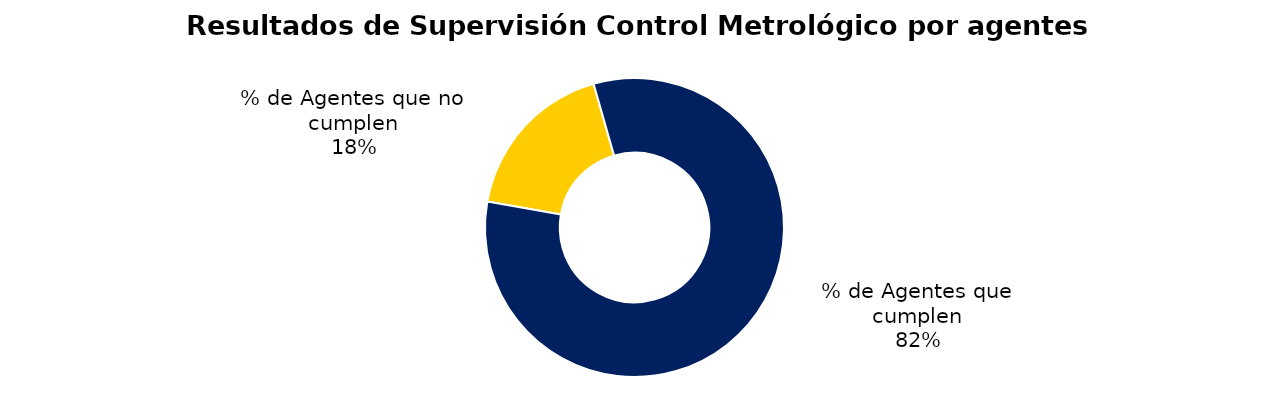
| Category | Series 0 |
|---|---|
| % de Agentes que no cumplen | 26 |
| % de Agentes que cumplen | 120 |